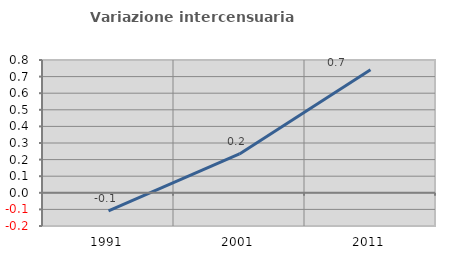
| Category | Variazione intercensuaria annua |
|---|---|
| 1991.0 | -0.11 |
| 2001.0 | 0.234 |
| 2011.0 | 0.741 |